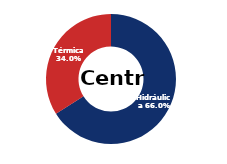
| Category | Centro |
|---|---|
| Eólica | 0 |
| Hidráulica | 2476.551 |
| Solar | 0.006 |
| Térmica | 1273.072 |